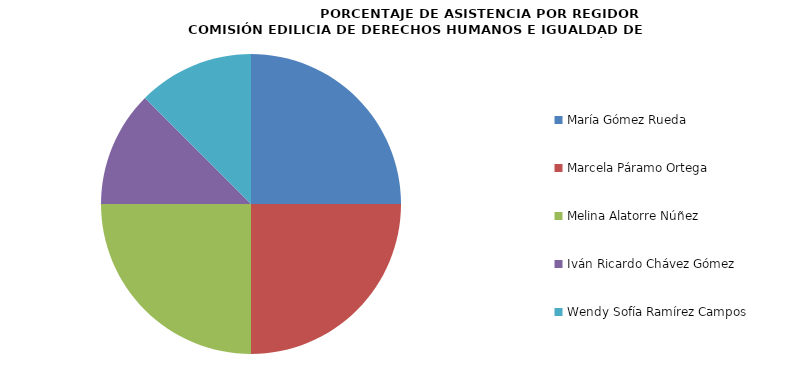
| Category | Series 0 |
|---|---|
| María Gómez Rueda | 100 |
| Marcela Páramo Ortega | 100 |
| Melina Alatorre Núñez | 100 |
| Iván Ricardo Chávez Gómez | 50 |
| Wendy Sofía Ramírez Campos | 50 |